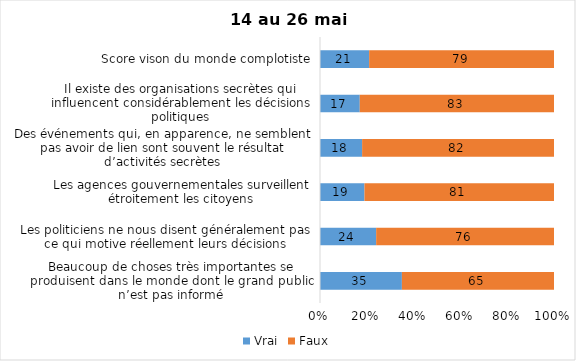
| Category | Vrai | Faux |
|---|---|---|
| Beaucoup de choses très importantes se produisent dans le monde dont le grand public n’est pas informé | 35 | 65 |
| Les politiciens ne nous disent généralement pas ce qui motive réellement leurs décisions | 24 | 76 |
| Les agences gouvernementales surveillent étroitement les citoyens | 19 | 81 |
| Des événements qui, en apparence, ne semblent pas avoir de lien sont souvent le résultat d’activités secrètes | 18 | 82 |
| Il existe des organisations secrètes qui influencent considérablement les décisions politiques | 17 | 83 |
| Score vison du monde complotiste | 21 | 79 |